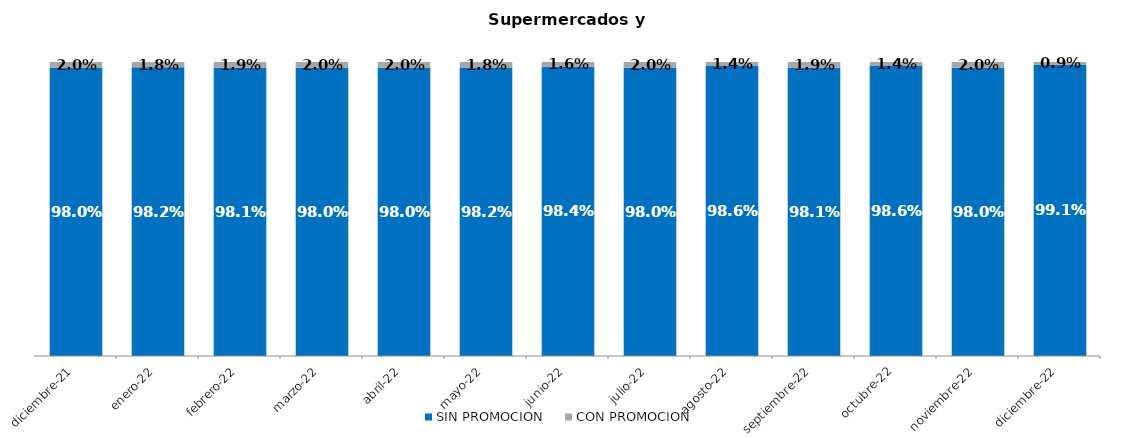
| Category | SIN PROMOCION   | CON PROMOCION   |
|---|---|---|
| 2021-12-01 | 0.98 | 0.02 |
| 2022-01-01 | 0.982 | 0.018 |
| 2022-02-01 | 0.981 | 0.019 |
| 2022-03-01 | 0.98 | 0.02 |
| 2022-04-01 | 0.98 | 0.02 |
| 2022-05-01 | 0.982 | 0.018 |
| 2022-06-01 | 0.984 | 0.016 |
| 2022-07-01 | 0.98 | 0.02 |
| 2022-08-01 | 0.986 | 0.014 |
| 2022-09-01 | 0.981 | 0.019 |
| 2022-10-01 | 0.986 | 0.014 |
| 2022-11-01 | 0.98 | 0.02 |
| 2022-12-01 | 0.991 | 0.009 |